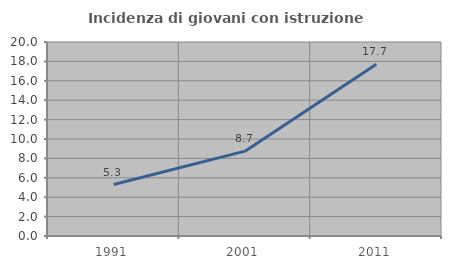
| Category | Incidenza di giovani con istruzione universitaria |
|---|---|
| 1991.0 | 5.306 |
| 2001.0 | 8.745 |
| 2011.0 | 17.695 |